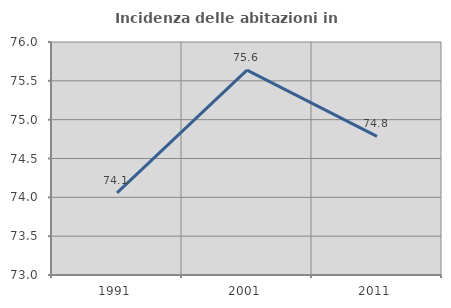
| Category | Incidenza delle abitazioni in proprietà  |
|---|---|
| 1991.0 | 74.057 |
| 2001.0 | 75.637 |
| 2011.0 | 74.785 |